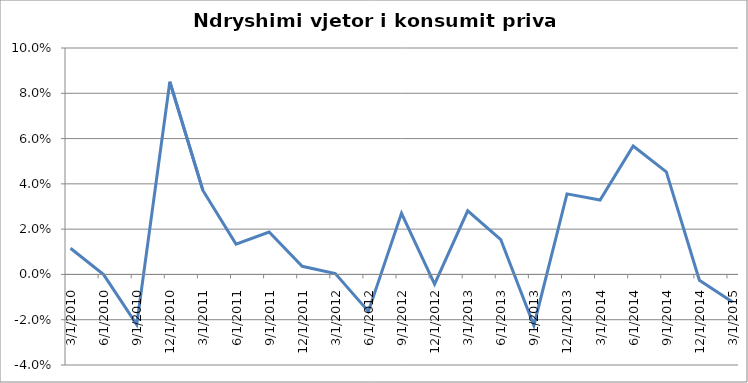
| Category | Ndryshimi vjetor i konsumit privat (%) |
|---|---|
| 03/31/2010 | 0.012 |
| 06/30/2010 | 0 |
| 09/30/2010 | -0.022 |
| 12/31/2010 | 0.085 |
| 03/31/2011 | 0.037 |
| 06/30/2011 | 0.013 |
| 09/30/2011 | 0.019 |
| 12/31/2011 | 0.004 |
| 03/31/2012 | 0 |
| 06/30/2012 | -0.016 |
| 09/30/2012 | 0.027 |
| 12/31/2012 | -0.004 |
| 03/31/2013 | 0.028 |
| 06/30/2013 | 0.015 |
| 09/30/2013 | -0.023 |
| 12/31/2013 | 0.036 |
| 03/31/2014 | 0.033 |
| 06/30/2014 | 0.057 |
| 09/30/2014 | 0.045 |
| 12/31/2014 | -0.003 |
| 03/31/2015 | -0.012 |